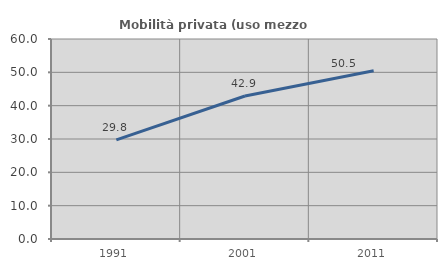
| Category | Mobilità privata (uso mezzo privato) |
|---|---|
| 1991.0 | 29.757 |
| 2001.0 | 42.898 |
| 2011.0 | 50.472 |